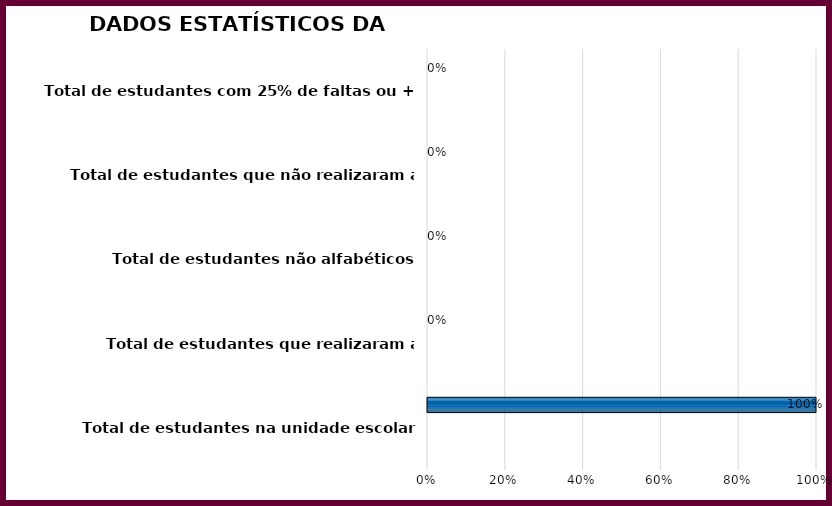
| Category | Series 0 | Series 1 | Series 2 | Series 3 |
|---|---|---|---|---|
| Total de estudantes na unidade escolar |  |  |  | 1 |
| Total de estudantes que realizaram a sondagem |  |  |  | 0 |
| Total de estudantes não alfabéticos |  |  |  | 0 |
| Total de estudantes que não realizaram a sondagem  |  |  |  | 0 |
| Total de estudantes com 25% de faltas ou + |  |  |  | 0 |